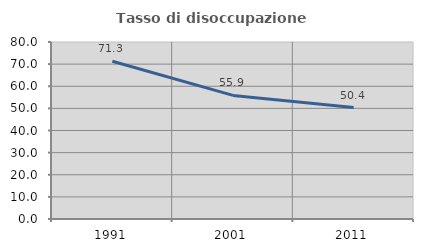
| Category | Tasso di disoccupazione giovanile  |
|---|---|
| 1991.0 | 71.279 |
| 2001.0 | 55.87 |
| 2011.0 | 50.355 |